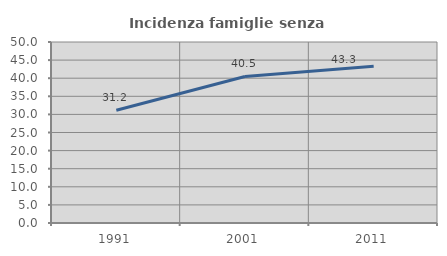
| Category | Incidenza famiglie senza nuclei |
|---|---|
| 1991.0 | 31.159 |
| 2001.0 | 40.49 |
| 2011.0 | 43.333 |